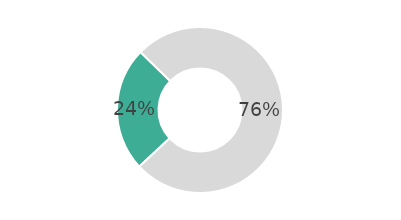
| Category | Series 0 |
|---|---|
| Participer à une vente entièrement dématérialisée | 24.221 |
| Non | 75.779 |